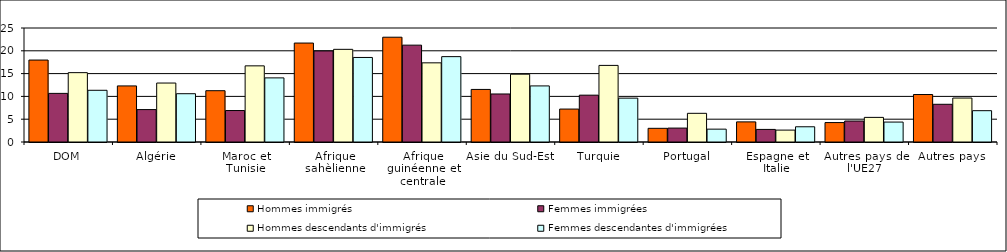
| Category | Hommes immigrés | Femmes immigrées | Hommes descendants d'immigrés | Femmes descendantes d'immigrées |
|---|---|---|---|---|
| DOM | 17.97 | 10.66 | 15.21 | 11.34 |
| Algérie | 12.3 | 7.11 | 12.93 | 10.59 |
| Maroc et Tunisie | 11.25 | 6.9 | 16.7 | 14.06 |
| Afrique sahèlienne | 21.7 | 19.97 | 20.32 | 18.54 |
| Afrique guinéenne et centrale | 22.98 | 21.24 | 17.36 | 18.72 |
| Asie du Sud-Est | 11.53 | 10.53 | 14.87 | 12.3 |
| Turquie | 7.22 | 10.27 | 16.8 | 9.62 |
| Portugal | 3 | 3.05 | 6.29 | 2.82 |
| Espagne et Italie | 4.41 | 2.76 | 2.61 | 3.34 |
| Autres pays de l'UE27 | 4.26 | 4.6 | 5.4 | 4.37 |
| Autres pays  | 10.41 | 8.27 | 9.64 | 6.87 |